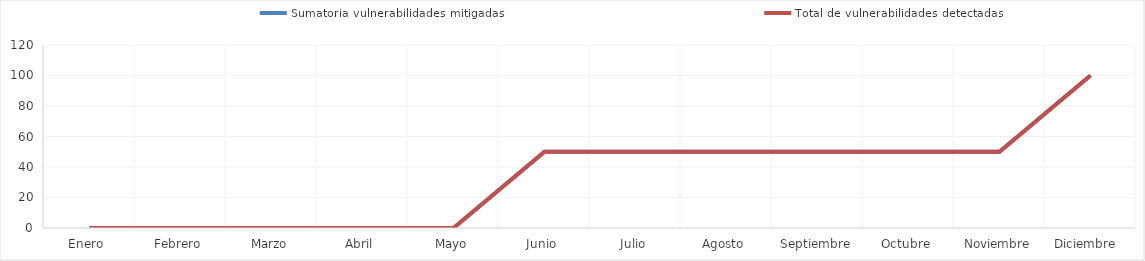
| Category | Sumatoria vulnerabilidades mitigadas | Total de vulnerabilidades detectadas |
|---|---|---|
| Enero  | 0 | 0 |
| Febrero | 0 | 0 |
| Marzo | 0 | 0 |
| Abril | 0 | 0 |
| Mayo | 0 | 0 |
| Junio | 50 | 50 |
| Julio | 50 | 50 |
| Agosto | 50 | 50 |
| Septiembre | 50 | 50 |
| Octubre | 50 | 50 |
| Noviembre | 50 | 50 |
| Diciembre  | 100 | 100 |